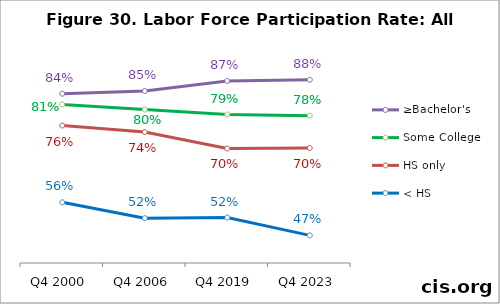
| Category | ≥Bachelor's | Some College | HS only | < HS |
|---|---|---|---|---|
| Q4 2000 | 0.842 | 0.814 | 0.759 | 0.558 |
| Q4 2006 | 0.849 | 0.8 | 0.742 | 0.517 |
| Q4 2019 | 0.875 | 0.787 | 0.699 | 0.519 |
| Q4 2023 | 0.878 | 0.784 | 0.7 | 0.472 |